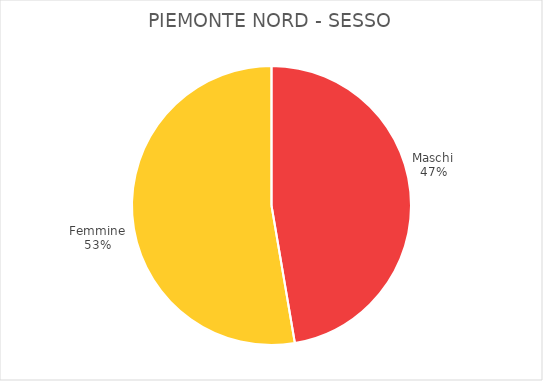
| Category | Piemonte Nord |
|---|---|
| Maschi | 2827 |
| Femmine | 3147 |